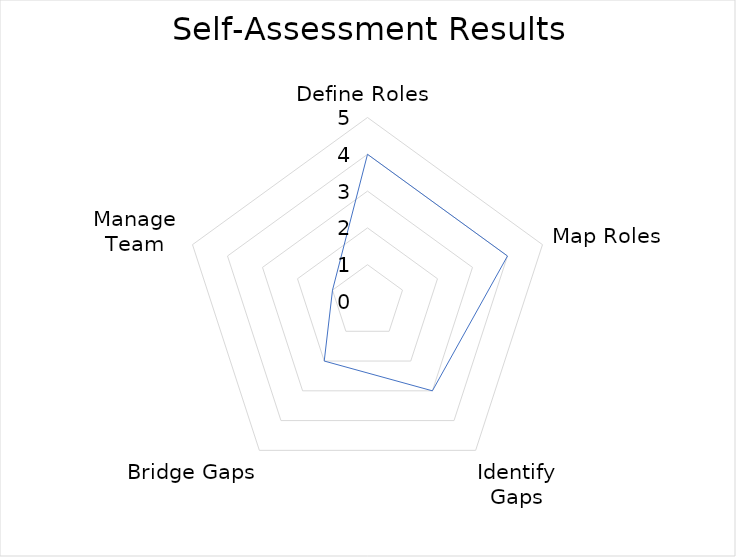
| Category | Series 0 |
|---|---|
| Define Roles | 4 |
| Map Roles | 4 |
| Identify Gaps | 3 |
| Bridge Gaps | 2 |
| Manage Team | 1 |